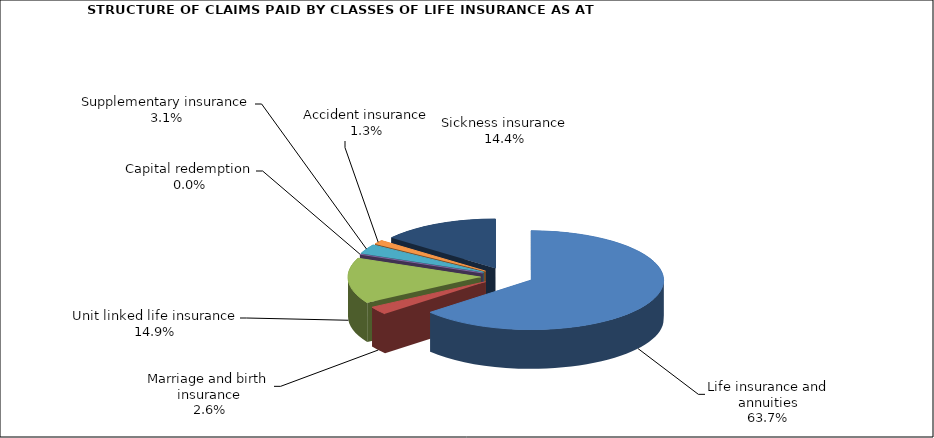
| Category | Series 0 |
|---|---|
| Life insurance and annuities | 126037224.904 |
| Marriage and birth insurance | 5207192.447 |
| Unit linked life insurance | 29484663.676 |
| Capital redemption | 0 |
| Supplementary insurance | 6109260.905 |
| Accident insurance | 2619216.122 |
| Sickness insurance | 28412685.423 |